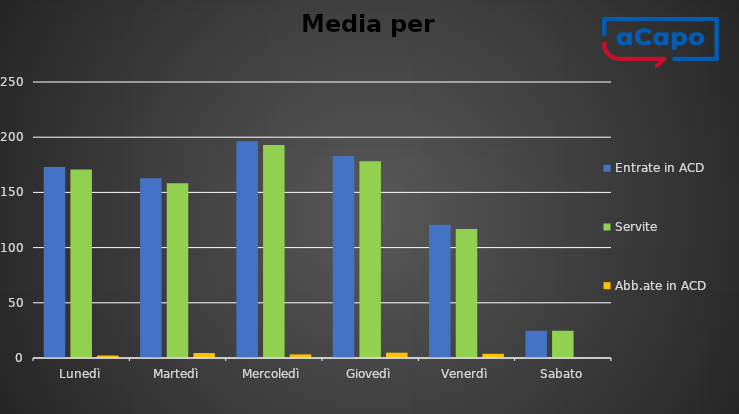
| Category | Entrate in ACD | Servite | Abb.ate in ACD |
|---|---|---|---|
| Lunedì | 173 | 170.75 | 2.25 |
| Martedì | 162.75 | 158.25 | 4.5 |
| Mercoledì | 196.25 | 193 | 3.25 |
| Giovedì | 183 | 178.2 | 4.8 |
| Venerdì | 120.6 | 116.8 | 3.8 |
| Sabato | 24.667 | 24.667 | 0 |